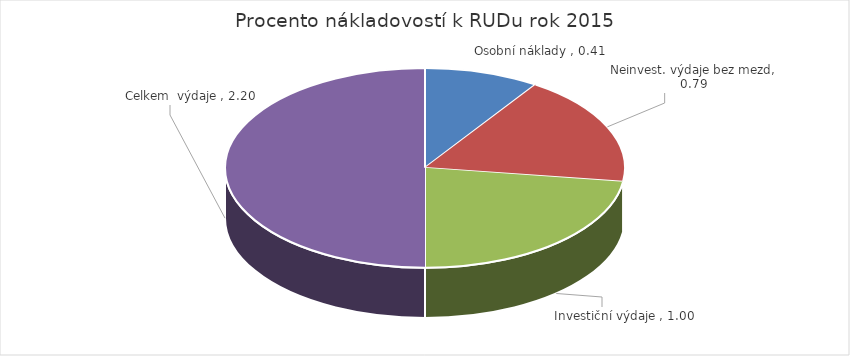
| Category | Series 0 |
|---|---|
| Osobní náklady  | 0.409 |
| Neinvest. výdaje bez mezd | 0.786 |
| Investiční výdaje  | 1.001 |
| Celkem  výdaje  | 2.197 |